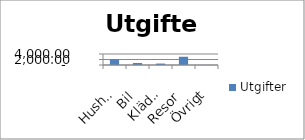
| Category |  Utgifter  |
|---|---|
| Hushåll | 2115 |
| Bil | 724.3 |
| Kläder | 525 |
| Resor | 3000 |
| Övrigt | 32 |